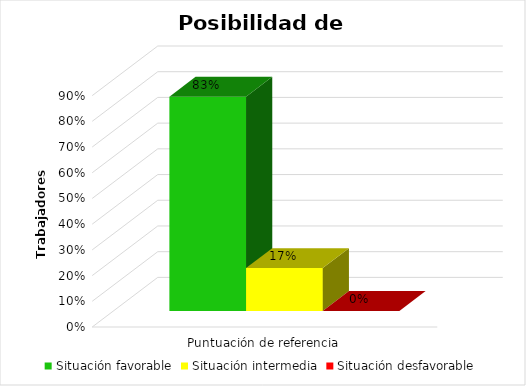
| Category | Situación favorable  | Situación intermedia | Situación desfavorable |
|---|---|---|---|
| 0 | 0.833 | 0.167 | 0 |